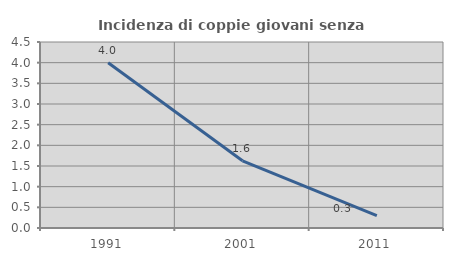
| Category | Incidenza di coppie giovani senza figli |
|---|---|
| 1991.0 | 4 |
| 2001.0 | 1.626 |
| 2011.0 | 0.3 |